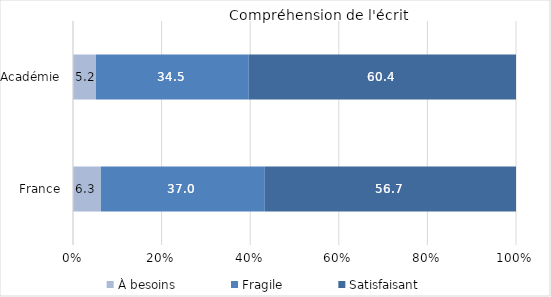
| Category | À besoins | Fragile | Satisfaisant |
|---|---|---|---|
| France | 6.3 | 37 | 56.7 |
| Académie | 5.2 | 34.5 | 60.4 |